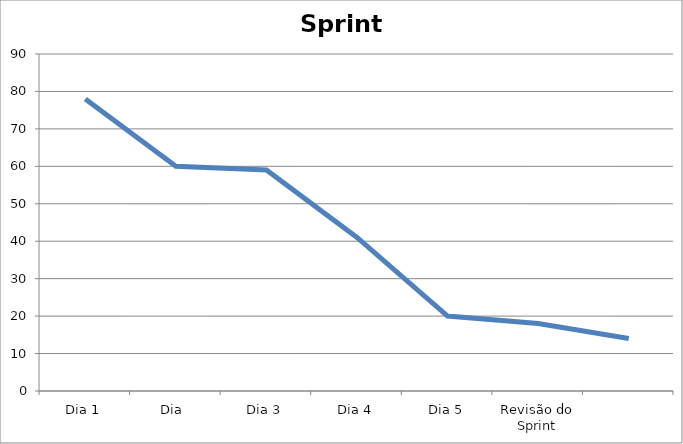
| Category | Sprint Burndown Chart |
|---|---|
| Dia 1 | 78 |
| Dia  | 60 |
| Dia 3 | 59 |
| Dia 4 | 41 |
| Dia 5 | 20 |
| Revisão do Sprint | 18 |